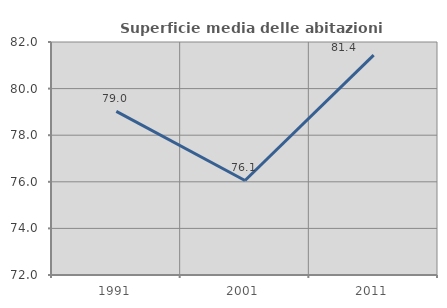
| Category | Superficie media delle abitazioni occupate |
|---|---|
| 1991.0 | 79.022 |
| 2001.0 | 76.057 |
| 2011.0 | 81.439 |